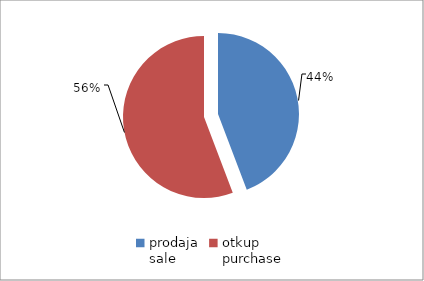
| Category | Series 0 |
|---|---|
| prodaja
sale | 10478543 |
| otkup
purchase | 13217014 |